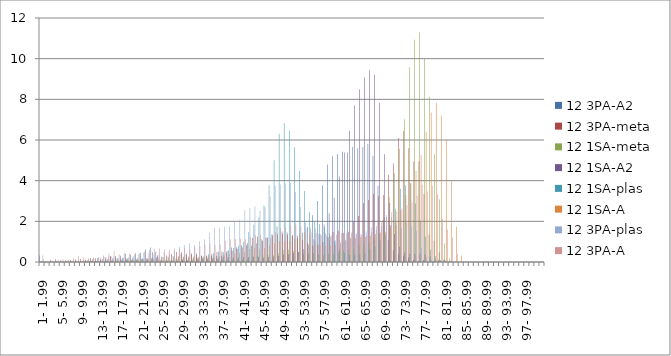
| Category | 12 3PA-A2 | 12 3PA-meta | 12 1SA-meta | 12 1SA-A2 | 12 1SA-plas | 12 1SA-A | 12 3PA-plas | 12 3PA-A |
|---|---|---|---|---|---|---|---|---|
|  1- 1.99 | 0.315 | 0.005 | 0.03 | 0.055 | 0.05 | 0.045 | 0.315 | 0.145 |
|  2- 2.99 | 0 | 0.02 | 0.01 | 0.005 | 0.015 | 0.005 | 0.06 | 0.02 |
|  3- 3.99 | 0 | 0.105 | 0 | 0.015 | 0.02 | 0.02 | 0.07 | 0.03 |
|  4- 4.99 | 0 | 0.13 | 0 | 0.025 | 0.03 | 0.025 | 0.115 | 0.045 |
|  5- 5.99 | 0 | 0.085 | 0.01 | 0.015 | 0.04 | 0.05 | 0.14 | 0.04 |
|  6- 6.99 | 0 | 0.085 | 0.015 | 0.015 | 0.035 | 0.055 | 0.12 | 0.085 |
|  7- 7.99 | 0 | 0.1 | 0.015 | 0.025 | 0.03 | 0.025 | 0.095 | 0.18 |
|  8- 8.99 | 0 | 0.13 | 0.025 | 0.03 | 0.04 | 0.04 | 0.08 | 0.3 |
|  9- 9.99 | 0.015 | 0.145 | 0.025 | 0.015 | 0.055 | 0.045 | 0.095 | 0.205 |
|  10- 10.99 | 0.07 | 0.105 | 0.03 | 0.025 | 0.085 | 0.055 | 0.135 | 0.18 |
|  11- 11.99 | 0.04 | 0.195 | 0.05 | 0.06 | 0.135 | 0.045 | 0.22 | 0.18 |
|  12- 12.99 | 0.065 | 0.185 | 0.02 | 0.055 | 0.19 | 0.05 | 0.25 | 0.215 |
|  13- 13.99 | 0.095 | 0.185 | 0.025 | 0.05 | 0.15 | 0.09 | 0.32 | 0.26 |
|  14- 14.99 | 0.13 | 0.235 | 0.035 | 0.065 | 0.15 | 0.09 | 0.28 | 0.42 |
|  15- 15.99 | 0.265 | 0.3 | 0.05 | 0.075 | 0.175 | 0.085 | 0.235 | 0.535 |
|  16- 16.99 | 0.295 | 0.18 | 0.06 | 0.055 | 0.195 | 0.095 | 0.175 | 0.38 |
|  17- 17.99 | 0.305 | 0.165 | 0.065 | 0.075 | 0.2 | 0.11 | 0.225 | 0.445 |
|  18- 18.99 | 0.405 | 0.17 | 0.1 | 0.105 | 0.19 | 0.095 | 0.23 | 0.42 |
|  19- 19.99 | 0.365 | 0.115 | 0.09 | 0.115 | 0.195 | 0.095 | 0.28 | 0.375 |
|  20- 20.99 | 0.435 | 0.13 | 0.105 | 0.09 | 0.185 | 0.11 | 0.36 | 0.43 |
|  21- 21.99 | 0.46 | 0.165 | 0.08 | 0.145 | 0.19 | 0.125 | 0.475 | 0.5 |
|  22- 22.99 | 0.61 | 0.17 | 0.08 | 0.11 | 0.215 | 0.15 | 0.445 | 0.585 |
|  23- 23.99 | 0.71 | 0.19 | 0.08 | 0.48 | 0.215 | 0.145 | 0.37 | 0.625 |
|  24- 24.99 | 0.51 | 0.225 | 0.065 | 0.32 | 0.255 | 0.12 | 0.385 | 0.665 |
|  25- 25.99 | 0.115 | 0.265 | 0.07 | 0.055 | 0.24 | 0.155 | 0.485 | 0.62 |
|  26- 26.99 | 0.085 | 0.325 | 0.095 | 0.045 | 0.27 | 0.205 | 0.465 | 0.615 |
|  27- 27.99 | 0.11 | 0.395 | 0.115 | 0.045 | 0.295 | 0.235 | 0.565 | 0.67 |
|  28- 28.99 | 0.165 | 0.49 | 0.13 | 0.065 | 0.265 | 0.265 | 0.745 | 0.665 |
|  29- 29.99 | 0.395 | 0.475 | 0.145 | 0.11 | 0.24 | 0.275 | 0.84 | 0.68 |
|  30- 30.99 | 0.345 | 0.415 | 0.125 | 0.075 | 0.21 | 0.27 | 0.905 | 0.655 |
|  31- 31.99 | 0.43 | 0.375 | 0.16 | 0.055 | 0.205 | 0.265 | 0.83 | 0.75 |
|  32- 32.99 | 0.42 | 0.34 | 0.19 | 0.135 | 0.235 | 0.225 | 1.025 | 0.79 |
|  33- 33.99 | 0.3 | 0.315 | 0.205 | 0.145 | 0.265 | 0.225 | 1.125 | 0.875 |
|  34- 34.99 | 0.28 | 0.325 | 0.19 | 0.14 | 0.385 | 0.265 | 1.425 | 0.915 |
|  35- 35.99 | 0.305 | 0.395 | 0.17 | 0.185 | 0.44 | 0.245 | 1.675 | 0.825 |
|  36- 36.99 | 0.29 | 0.495 | 0.135 | 0.195 | 0.5 | 0.3 | 1.675 | 0.855 |
|  37- 37.99 | 0.325 | 0.515 | 0.13 | 0.255 | 0.475 | 0.315 | 1.715 | 1.04 |
|  38- 38.99 | 0.47 | 0.545 | 0.13 | 0.245 | 0.575 | 0.38 | 1.76 | 1.125 |
|  39- 39.99 | 0.715 | 0.555 | 0.15 | 0.215 | 0.685 | 0.435 | 2.02 | 1.135 |
|  40- 40.99 | 0.73 | 0.655 | 0.14 | 0.215 | 0.805 | 0.44 | 2.08 | 1.145 |
|  41- 41.99 | 0.81 | 0.71 | 0.15 | 0.245 | 0.995 | 0.495 | 2.545 | 1.115 |
|  42- 42.99 | 0.82 | 0.925 | 0.155 | 0.245 | 1.475 | 0.635 | 2.645 | 1.23 |
|  43- 43.99 | 0.795 | 1.175 | 0.23 | 0.26 | 1.835 | 0.695 | 2.735 | 1.32 |
|  44- 44.99 | 0.92 | 1.25 | 0.305 | 0.25 | 2.18 | 0.64 | 2.51 | 1.34 |
|  45- 45.99 | 1.115 | 1.04 | 0.32 | 0.21 | 2.775 | 0.69 | 2.69 | 1.19 |
|  46- 46.99 | 1.2 | 1.195 | 0.34 | 0.23 | 3.77 | 0.81 | 3.205 | 1.195 |
|  47- 47.99 | 1.365 | 1.305 | 0.345 | 0.265 | 5.005 | 0.905 | 3.755 | 1.465 |
|  48- 48.99 | 1.745 | 1.365 | 0.44 | 0.31 | 6.305 | 1.03 | 3.815 | 1.66 |
|  49- 49.99 | 1.5 | 1.365 | 0.59 | 0.365 | 6.82 | 1.025 | 3.855 | 1.71 |
|  50- 50.99 | 1.45 | 1.34 | 0.62 | 0.38 | 6.47 | 1.02 | 3.89 | 1.795 |
|  51- 51.99 | 1.26 | 1.33 | 0.54 | 0.425 | 5.64 | 1.115 | 3.44 | 1.845 |
|  52- 52.99 | 1.29 | 1.175 | 0.495 | 0.49 | 4.48 | 1.335 | 2.7 | 1.75 |
|  53- 53.99 | 1.435 | 1.08 | 0.405 | 0.64 | 3.495 | 1.46 | 1.94 | 1.645 |
|  54- 54.99 | 1.72 | 0.94 | 0.4 | 0.825 | 2.475 | 1.33 | 1.685 | 1.495 |
|  55- 55.99 | 2.3 | 0.805 | 0.43 | 1.115 | 1.975 | 0.995 | 1.65 | 1.435 |
|  56- 56.99 | 2.995 | 0.845 | 0.365 | 1.39 | 1.87 | 0.82 | 1.37 | 1.315 |
|  57- 57.99 | 3.77 | 0.985 | 0.33 | 1.84 | 1.71 | 0.79 | 1.43 | 1.315 |
|  58- 58.99 | 4.8 | 1.215 | 0.4 | 2.385 | 1.39 | 0.805 | 1.25 | 1.3 |
|  59- 59.99 | 5.2 | 1.48 | 0.41 | 3.155 | 1 | 0.83 | 1.065 | 1.35 |
|  60- 60.99 | 5.31 | 1.535 | 0.475 | 4.2 | 0.615 | 0.9 | 1 | 1.415 |
|  61- 61.99 | 5.425 | 1.43 | 0.565 | 5.38 | 0.45 | 1.04 | 1.09 | 1.415 |
|  62- 62.99 | 5.38 | 1.49 | 0.625 | 6.46 | 0.34 | 1.155 | 1.21 | 1.445 |
|  63- 63.99 | 5.65 | 1.98 | 0.665 | 7.715 | 0.33 | 1.165 | 1.355 | 1.4 |
|  64- 64.99 | 5.59 | 2.265 | 0.83 | 8.495 | 0.385 | 1.225 | 1.38 | 1.32 |
|  65- 65.99 | 5.66 | 2.89 | 0.925 | 9.07 | 0.455 | 1.23 | 1.505 | 1.305 |
|  66- 66.99 | 5.82 | 3.055 | 0.965 | 9.435 | 0.645 | 1.28 | 1.71 | 1.46 |
|  67- 67.99 | 5.21 | 3.355 | 1.14 | 9.225 | 0.765 | 1.38 | 1.58 | 1.76 |
|  68- 68.99 | 3.755 | 3.24 | 1.405 | 7.83 | 1.055 | 1.455 | 1.76 | 2.005 |
|  69- 69.99 | 2.065 | 3.3 | 2.175 | 5.3 | 1.34 | 1.485 | 2.295 | 2.185 |
|  70- 70.99 | 1.085 | 4.29 | 3.215 | 2.9 | 1.82 | 1.705 | 2.21 | 2.45 |
|  71- 71.99 | 0.58 | 4.845 | 4.36 | 1.375 | 2.62 | 1.985 | 1.825 | 2.485 |
|  72- 72.99 | 0.38 | 6.095 | 5.57 | 0.75 | 3.605 | 2.535 | 1.67 | 2.63 |
|  73- 73.99 | 0.31 | 6.445 | 7.025 | 0.465 | 3.76 | 3.295 | 1.94 | 2.785 |
|  74- 74.99 | 0.22 | 5.59 | 9.58 | 0.41 | 3.87 | 3.875 | 1.76 | 2.92 |
|  75- 75.99 | 0.105 | 4.945 | 10.93 | 0.39 | 2.86 | 4.475 | 1.52 | 3.255 |
|  76- 76.99 | 0.045 | 4.96 | 11.3 | 0.41 | 2.04 | 5.26 | 0.685 | 3.8 |
|  77- 77.99 | 0.095 | 3.35 | 10.01 | 0.375 | 1.24 | 6.405 | 0.26 | 3.47 |
|  78- 78.99 | 0.005 | 1.35 | 8.125 | 0.275 | 0.61 | 7.355 | 0.105 | 3.74 |
|  79- 79.99 | 0.035 | 1.04 | 5.3 | 0.14 | 0.285 | 7.83 | 0.02 | 3.345 |
|  80- 80.99 | 0.115 | 0.475 | 3.08 | 0.06 | 0.1 | 7.2 | 0.015 | 2.13 |
|  81- 81.99 | 0.08 | 0.135 | 0.915 | 0.075 | 0.01 | 5.995 | 0.065 | 1.595 |
|  82- 82.99 | 0.02 | 0.005 | 0.19 | 0.045 | 0 | 4 | 0.06 | 1.2 |
|  83- 83.99 | 0 | 0 | 0.025 | 0.005 | 0 | 1.735 | 0.005 | 0.39 |
|  84- 84.99 | 0 | 0 | 0 | 0 | 0 | 0.31 | 0 | 0.015 |
|  85- 85.99 | 0 | 0 | 0 | 0 | 0 | 0.005 | 0 | 0 |
|  86- 86.99 | 0 | 0 | 0 | 0 | 0 | 0 | 0 | 0 |
|  87- 87.99 | 0 | 0 | 0 | 0 | 0 | 0 | 0 | 0 |
|  88- 88.99 | 0 | 0 | 0 | 0 | 0 | 0 | 0 | 0 |
|  89- 89.99 | 0 | 0 | 0 | 0 | 0 | 0 | 0 | 0 |
|  90- 90.99 | 0 | 0 | 0 | 0 | 0 | 0 | 0 | 0 |
|  91- 91.99 | 0 | 0 | 0 | 0 | 0 | 0 | 0 | 0 |
|  92- 92.99 | 0 | 0 | 0 | 0 | 0 | 0 | 0 | 0 |
|  93- 93.99 | 0 | 0 | 0 | 0 | 0 | 0 | 0 | 0 |
|  94- 94.99 | 0 | 0 | 0 | 0 | 0 | 0 | 0 | 0 |
|  95- 95.99 | 0 | 0 | 0 | 0 | 0 | 0 | 0 | 0 |
|  96- 96.99 | 0 | 0 | 0 | 0 | 0 | 0 | 0 | 0 |
|  97- 97.99 | 0 | 0 | 0 | 0 | 0 | 0 | 0 | 0 |
|  98- 98.99 | 0 | 0 | 0 | 0 | 0 | 0 | 0 | 0 |
|  99- 99.99 | 0 | 0 | 0 | 0 | 0 | 0 | 0 | 0 |
|  100- 42 | 0 | 0 | 0 | 0 | 0 | 0 | 0 | 0 |